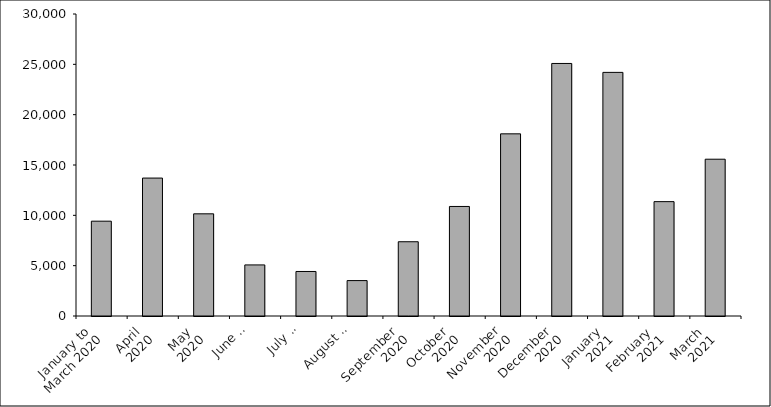
| Category | Series 0 |
|---|---|
| January to 
March 2020 | 9420 |
| April 
2020 | 13702 |
| May 
2020 | 10151 |
| June 
2020 | 5074 |
| July 
2020 | 4423 |
| August 
2020 | 3518 |
| September 
2020 | 7377 |
| October 
2020 | 10881 |
| November 
2020 | 18095 |
| December 
2020 | 25086 |
| January 
2021 | 24200 |
| February 
2021 | 11361 |
| March 
2021 | 15575 |